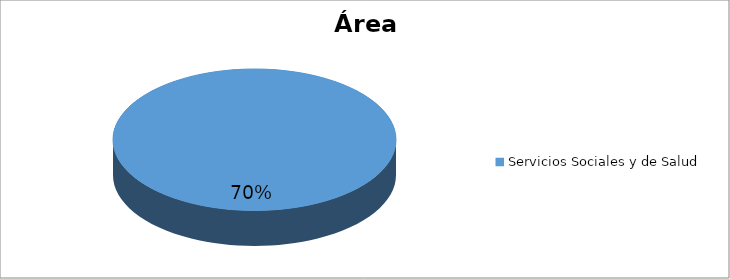
| Category | Series 0 |
|---|---|
| Servicios Sociales y de Salud | 0.7 |